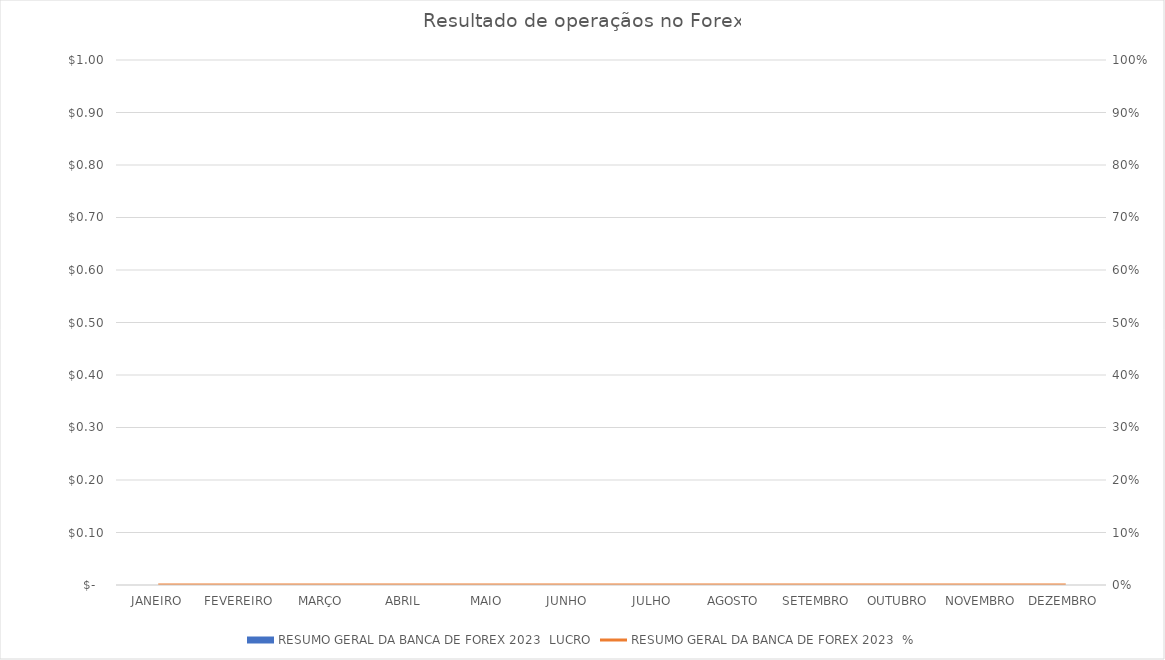
| Category | RESUMO GERAL DA BANCA DE FOREX 2023 |
|---|---|
| JANEIRO | 0 |
| FEVEREIRO | 0 |
| MARÇO | 0 |
| ABRIL | 0 |
| MAIO | 0 |
| JUNHO  | 0 |
| JULHO | 0 |
| AGOSTO | 0 |
| SETEMBRO | 0 |
| OUTUBRO | 0 |
| NOVEMBRO | 0 |
| DEZEMBRO | 0 |